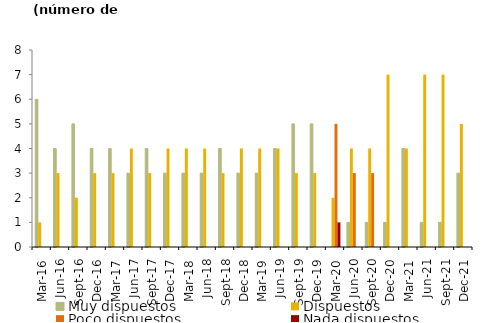
| Category | Muy dispuestos | Dispuestos | Poco dispuestos | Nada dispuestos |
|---|---|---|---|---|
| 2016-03-01 | 6 | 1 | 0 | 0 |
| 2016-06-01 | 4 | 3 | 0 | 0 |
| 2016-09-01 | 5 | 2 | 0 | 0 |
| 2016-12-01 | 4 | 3 | 0 | 0 |
| 2017-03-01 | 4 | 3 | 0 | 0 |
| 2017-06-01 | 3 | 4 | 0 | 0 |
| 2017-09-01 | 4 | 3 | 0 | 0 |
| 2017-12-01 | 3 | 4 | 0 | 0 |
| 2018-03-01 | 3 | 4 | 0 | 0 |
| 2018-06-01 | 3 | 4 | 0 | 0 |
| 2018-09-01 | 4 | 3 | 0 | 0 |
| 2018-12-01 | 3 | 4 | 0 | 0 |
| 2019-03-01 | 3 | 4 | 0 | 0 |
| 2019-06-01 | 4 | 4 | 0 | 0 |
| 2019-09-01 | 5 | 3 | 0 | 0 |
| 2019-12-01 | 5 | 3 | 0 | 0 |
| 2020-03-01 | 0 | 2 | 5 | 1 |
| 2020-06-01 | 1 | 4 | 3 | 0 |
| 2020-09-01 | 1 | 4 | 3 | 0 |
| 2020-12-01 | 1 | 7 | 0 | 0 |
| 2021-03-01 | 4 | 4 | 0 | 0 |
| 2021-06-01 | 1 | 7 | 0 | 0 |
| 2021-09-01 | 1 | 7 | 0 | 0 |
| 2021-12-01 | 3 | 5 | 0 | 0 |